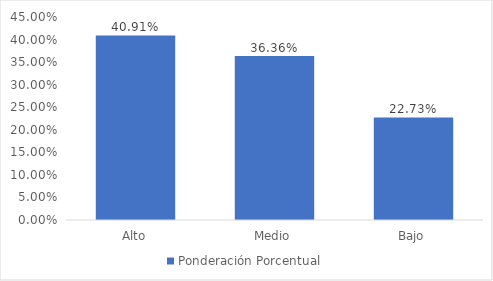
| Category | Ponderación Porcentual |
|---|---|
| Alto | 0.409 |
| Medio | 0.364 |
| Bajo | 0.227 |